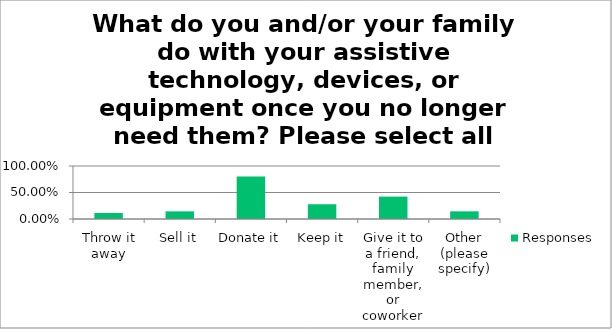
| Category | Responses |
|---|---|
| Throw it away | 0.113 |
| Sell it | 0.144 |
| Donate it | 0.804 |
| Keep it | 0.278 |
| Give it to a friend, family member, or coworker | 0.423 |
| Other (please specify) | 0.144 |